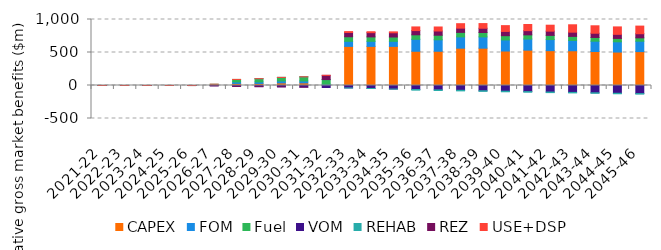
| Category | CAPEX | FOM | Fuel | VOM | REHAB | REZ | USE+DSP |
|---|---|---|---|---|---|---|---|
| 2021-22 | -0.004 | 0 | -0.001 | 0 | 0 | 0 | 0 |
| 2022-23 | -0.008 | -0.001 | -0.002 | 0 | 0 | 0 | 0 |
| 2023-24 | -0.009 | -0.002 | -0.002 | -0.001 | 0 | 0 | -0.001 |
| 2024-25 | -0.012 | -0.002 | -0.006 | 0 | 0 | 0 | -0.001 |
| 2025-26 | -0.011 | -0.001 | -0.476 | 0.061 | 0 | 0 | -0.002 |
| 2026-27 | -0.013 | -0.002 | 19.139 | -4.66 | 0 | 0 | 0.17 |
| 2027-28 | 31.146 | 23.055 | 37.733 | -13.278 | 0 | 0 | 0.17 |
| 2028-29 | 31.145 | 23.055 | 48.563 | -17.107 | 0 | 0 | 0.17 |
| 2029-30 | 39.7 | 28.657 | 54.237 | -20.006 | 0 | 0 | 0.17 |
| 2030-31 | 39.696 | 28.657 | 62.8 | -24.539 | 0 | 0 | 0.169 |
| 2031-32 | -2.457 | 19.529 | 70.092 | -27.673 | 0 | 64.139 | 0.169 |
| 2032-33 | 592.796 | 76.723 | 69.173 | -36.895 | 0 | 64.139 | 13.816 |
| 2033-34 | 592.793 | 76.722 | 67.056 | -45.661 | 0 | 64.139 | 13.816 |
| 2034-35 | 592.793 | 76.722 | 65.356 | -54.051 | 0 | 64.139 | 13.822 |
| 2035-36 | 518.651 | 181.309 | 68.146 | -60.369 | -10.02 | 64.139 | 55.244 |
| 2036-37 | 518.653 | 173.954 | 69.124 | -66.649 | -8.714 | 64.139 | 60.693 |
| 2037-38 | 565.517 | 170.878 | 68.325 | -72.739 | -8.714 | 64.139 | 67.689 |
| 2038-39 | 565.516 | 170.878 | 66.892 | -79.807 | -8.714 | 64.139 | 70.831 |
| 2039-40 | 522.33 | 167.764 | 64.799 | -86.502 | -8.714 | 64.139 | 88.079 |
| 2040-41 | 535.788 | 168.25 | 63.176 | -92.565 | -8.714 | 64.139 | 92.64 |
| 2041-42 | 528.067 | 168.077 | 63.2 | -99.053 | -8.714 | 64.139 | 90.172 |
| 2042-43 | 526.416 | 156.729 | 60.714 | -104.849 | -7.314 | 64.139 | 112.001 |
| 2043-44 | 515.346 | 156.002 | 56.36 | -110.505 | -7.314 | 64.139 | 112.953 |
| 2044-45 | 506.589 | 155.504 | 51.119 | -117.663 | -7.313 | 61.799 | 112.824 |
| 2045-46 | 513.532 | 157.821 | 50.883 | -122.571 | -7.313 | 62.163 | 115.629 |